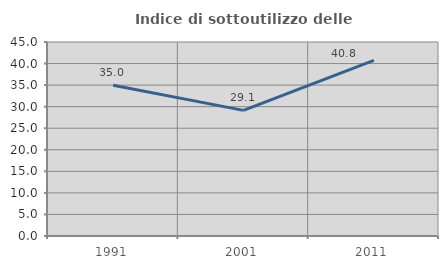
| Category | Indice di sottoutilizzo delle abitazioni  |
|---|---|
| 1991.0 | 34.975 |
| 2001.0 | 29.146 |
| 2011.0 | 40.761 |